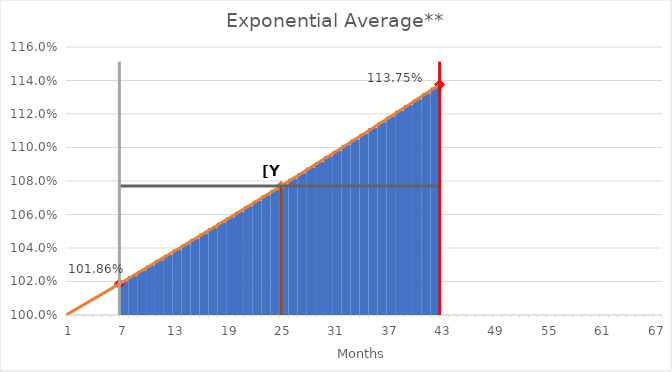
| Category | Exponential Area |
|---|---|
| 0 | 0 |
| 1 | 0 |
| 2 | 0 |
| 3 | 0 |
| 4 | 0 |
| 5 | 0 |
| 6 | 1.02 |
| 7 | 1.023 |
| 8 | 1.026 |
| 9 | 1.03 |
| 10 | 1.033 |
| 11 | 1.036 |
| 12 | 1.039 |
| 13 | 1.042 |
| 14 | 1.045 |
| 15 | 1.049 |
| 16 | 1.052 |
| 17 | 1.055 |
| 18 | 1.058 |
| 19 | 1.062 |
| 20 | 1.065 |
| 21 | 1.068 |
| 22 | 1.071 |
| 23 | 1.075 |
| 24 | 1.078 |
| 25 | 1.081 |
| 26 | 1.085 |
| 27 | 1.088 |
| 28 | 1.091 |
| 29 | 1.095 |
| 30 | 1.098 |
| 31 | 1.101 |
| 32 | 1.105 |
| 33 | 1.108 |
| 34 | 1.112 |
| 35 | 1.115 |
| 36 | 1.118 |
| 37 | 1.122 |
| 38 | 1.125 |
| 39 | 1.129 |
| 40 | 1.132 |
| 41 | 1.136 |
| 42 | 0 |
| 43 | 0 |
| 44 | 0 |
| 45 | 0 |
| 46 | 0 |
| 47 | 0 |
| 48 | 0 |
| 49 | 0 |
| 50 | 0 |
| 51 | 0 |
| 52 | 0 |
| 53 | 0 |
| 54 | 0 |
| 55 | 0 |
| 56 | 0 |
| 57 | 0 |
| 58 | 0 |
| 59 | 0 |
| 60 | 0 |
| 61 | 0 |
| 62 | 0 |
| 63 | 0 |
| 64 | 0 |
| 65 | 0 |
| 66 | 0 |